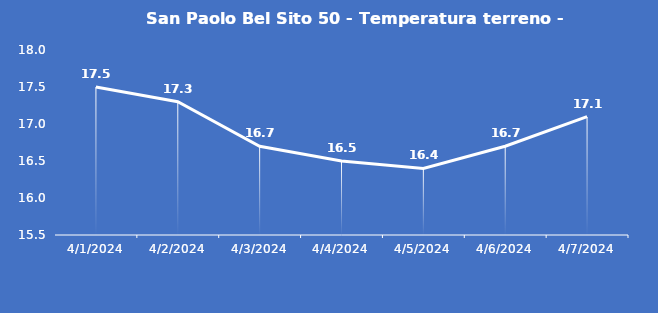
| Category | San Paolo Bel Sito 50 - Temperatura terreno - Grezzo (°C) |
|---|---|
| 4/1/24 | 17.5 |
| 4/2/24 | 17.3 |
| 4/3/24 | 16.7 |
| 4/4/24 | 16.5 |
| 4/5/24 | 16.4 |
| 4/6/24 | 16.7 |
| 4/7/24 | 17.1 |